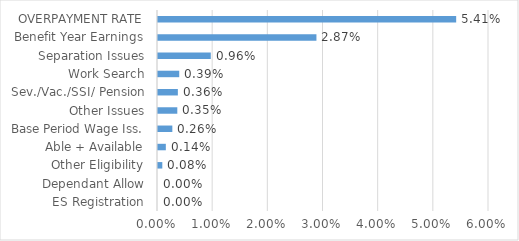
| Category | Series 0 |
|---|---|
| ES Registration | 0 |
| Dependant Allow | 0 |
| Other Eligibility | 0.001 |
| Able + Available | 0.001 |
| Base Period Wage Iss. | 0.003 |
| Other Issues | 0.004 |
| Sev./Vac./SSI/ Pension | 0.004 |
| Work Search | 0.004 |
| Separation Issues | 0.01 |
| Benefit Year Earnings | 0.029 |
| OVERPAYMENT RATE | 0.054 |